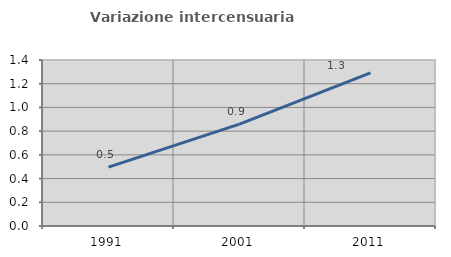
| Category | Variazione intercensuaria annua |
|---|---|
| 1991.0 | 0.497 |
| 2001.0 | 0.859 |
| 2011.0 | 1.291 |